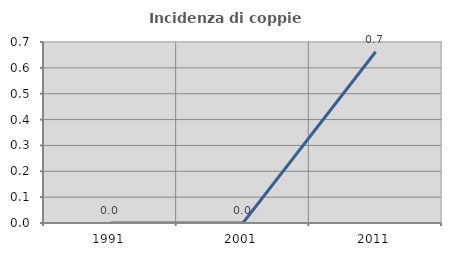
| Category | Incidenza di coppie miste |
|---|---|
| 1991.0 | 0 |
| 2001.0 | 0 |
| 2011.0 | 0.662 |